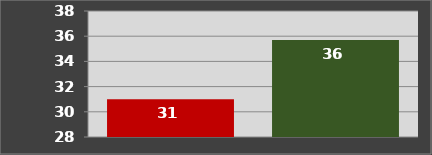
| Category | Benötigte Färsen | Produzierte Färsen |
|---|---|---|
| 0 | 31 | 35.691 |